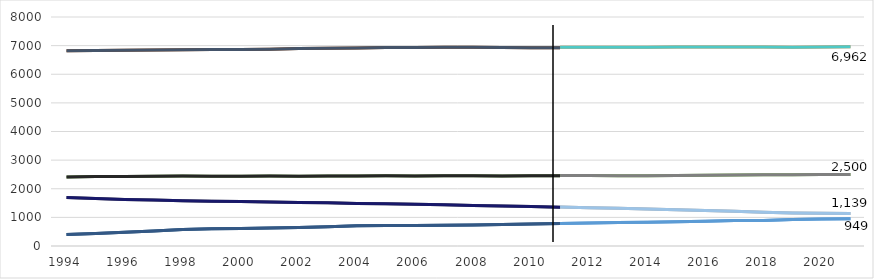
| Category | Collèges (hors Mayotte) | Collèges (avec Mayotte) | LP (hors Mayotte) | LP (avec Mayotte) | LEGT (hors Mayotte) | LEGT (avec Mayotte) | dont LPO (hors Mayotte) | dont LPO (avec Mayotte) |
|---|---|---|---|---|---|---|---|---|
| 1994 |  |  |  |  |  |  |  |  |
| 1995 |  |  |  |  |  |  |  |  |
| 1996 |  |  |  |  |  |  |  |  |
| 1997 |  |  |  |  |  |  |  |  |
| 1998 |  |  |  |  |  |  |  |  |
| 1999 |  |  |  |  |  |  |  |  |
| 2000 |  |  |  |  |  |  |  |  |
| 2001 |  |  |  |  |  |  |  |  |
| 2002 |  |  |  |  |  |  |  |  |
| 2003 |  |  |  |  |  |  |  |  |
| 2004 |  |  |  |  |  |  |  |  |
| 2005 |  |  |  |  |  |  |  |  |
| 2006 |  |  |  |  |  |  |  |  |
| 2007 |  |  |  |  |  |  |  |  |
| 2008 |  |  |  |  |  |  |  |  |
| 2009 |  |  |  |  |  |  |  |  |
| 2010 |  |  |  |  |  |  |  |  |
| 2011 |  |  |  |  |  |  |  |  |
| 2012 |  |  |  |  |  |  |  |  |
| 2013 |  |  |  |  |  |  |  |  |
| 2014 |  |  |  |  |  |  |  |  |
| 2015 |  |  |  |  |  |  |  |  |
| 2016 |  |  |  |  |  |  |  |  |
| 2017 |  |  |  |  |  |  |  |  |
| 2018 |  |  |  |  |  |  |  |  |
| 2019 |  |  |  |  |  |  |  |  |
| 2020 |  |  |  |  |  |  |  |  |
| 2021 |  |  |  |  |  |  |  |  |